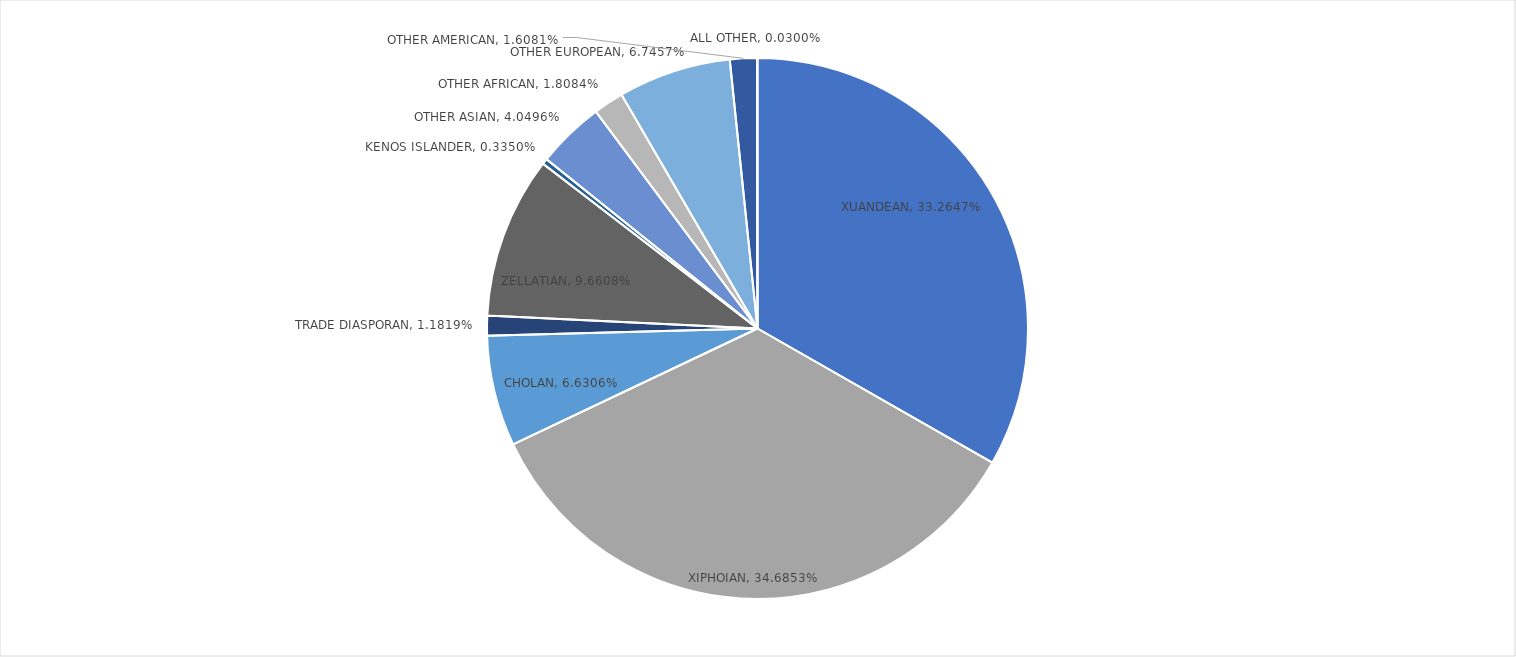
| Category | Series 0 |
|---|---|
| XUANDEAN | 0.333 |
| XIPHOIAN | 0.347 |
| CHOLAN | 0.066 |
| TRADE DIASPORAN | 0.012 |
| ZELLATIAN | 0.097 |
| KENOS ISLANDER | 0.003 |
| OTHER ASIAN | 0.04 |
| OTHER AFRICAN | 0.018 |
| OTHER EUROPEAN | 0.067 |
| OTHER AMERICAN | 0.016 |
| ALL OTHER | 0 |